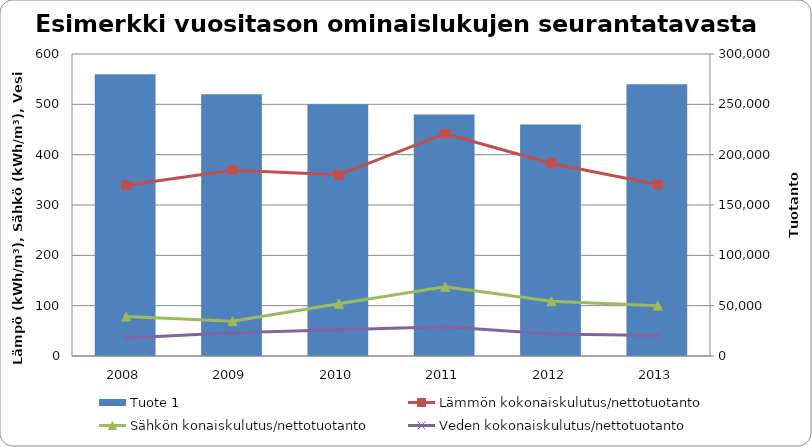
| Category | Tuote 1 |
|---|---|
| 2008.0 | 280000 |
| 2009.0 | 260000 |
| 2010.0 | 250000 |
| 2011.0 | 240000 |
| 2012.0 | 230000 |
| 2013.0 | 270000 |